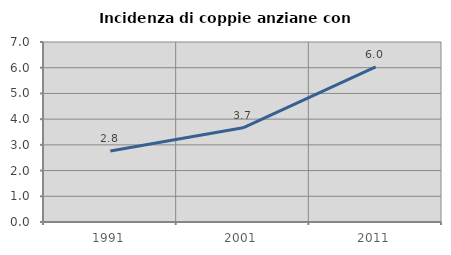
| Category | Incidenza di coppie anziane con figli |
|---|---|
| 1991.0 | 2.764 |
| 2001.0 | 3.662 |
| 2011.0 | 6.036 |